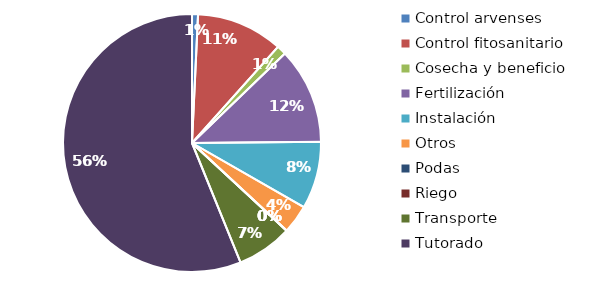
| Category | Valor |
|---|---|
| Control arvenses | 40000 |
| Control fitosanitario | 580000 |
| Cosecha y beneficio | 64000 |
| Fertilización | 643000 |
| Instalación | 452000 |
| Otros | 192000 |
| Podas | 0 |
| Riego | 0 |
| Transporte | 372000 |
| Tutorado | 3000000 |